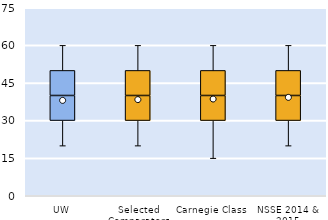
| Category | 25th | 50th | 75th |
|---|---|---|---|
| UW | 30 | 10 | 10 |
| Selected Comparators | 30 | 10 | 10 |
| Carnegie Class | 30 | 10 | 10 |
| NSSE 2014 & 2015 | 30 | 10 | 10 |